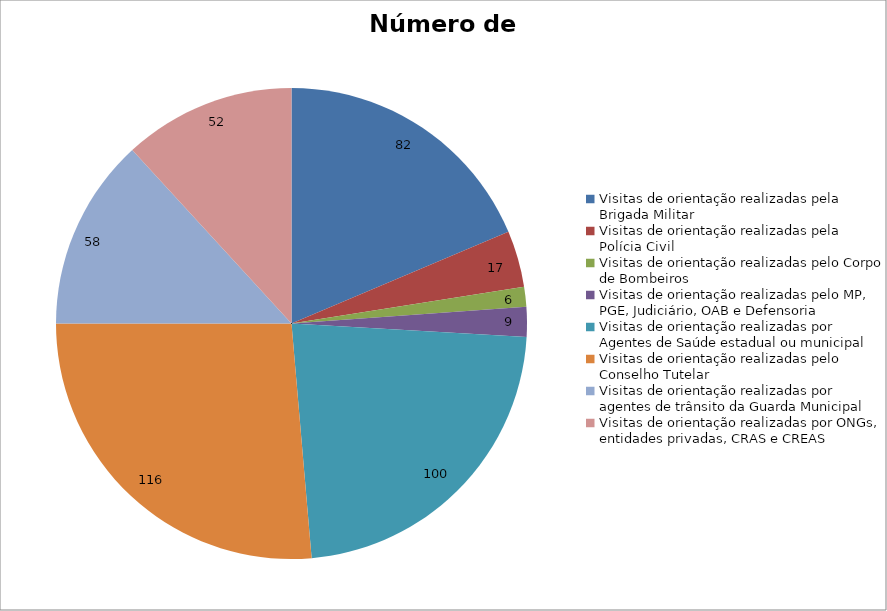
| Category | Número de Ações |
|---|---|
| Visitas de orientação realizadas pela Brigada Militar | 82 |
| Visitas de orientação realizadas pela Polícia Civil | 17 |
| Visitas de orientação realizadas pelo Corpo de Bombeiros | 6 |
| Visitas de orientação realizadas pelo MP, PGE, Judiciário, OAB e Defensoria | 9 |
| Visitas de orientação realizadas por Agentes de Saúde estadual ou municipal | 100 |
| Visitas de orientação realizadas pelo Conselho Tutelar | 116 |
| Visitas de orientação realizadas por agentes de trânsito da Guarda Municipal | 58 |
| Visitas de orientação realizadas por ONGs, entidades privadas, CRAS e CREAS | 52 |